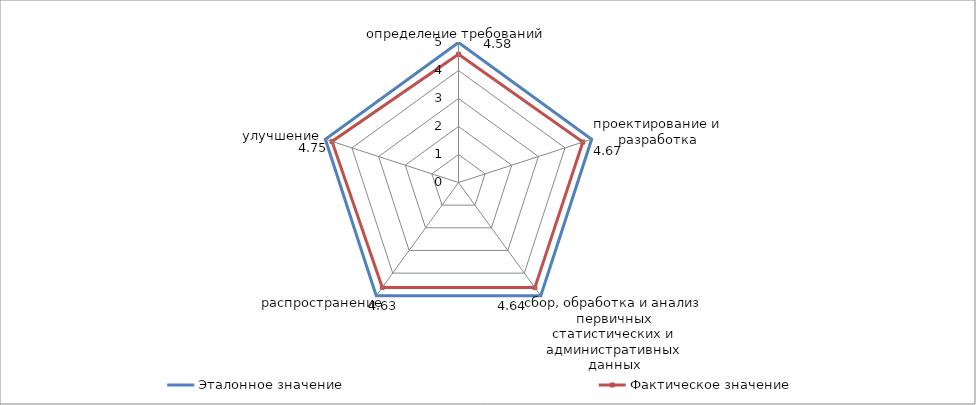
| Category | Эталонное значение | Фактическое значение |
|---|---|---|
| определение требований | 5 | 4.58 |
| проектирование и разработка | 5 | 4.67 |
| сбор, обработка и анализ первичных статистических и административных данных | 5 | 4.64 |
| распространение | 5 | 4.63 |
| улучшение | 5 | 4.75 |